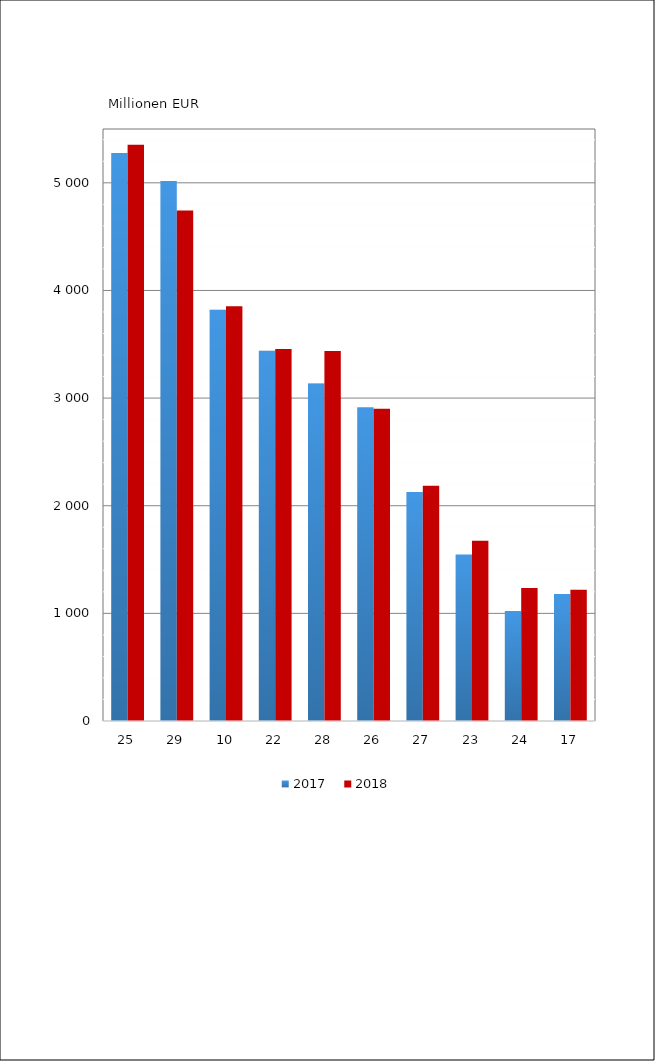
| Category | 2017 | 2018 |
|---|---|---|
| 0 | 5277.548 | 5353.251 |
| 1 | 5017.037 | 4742.836 |
| 2 | 3821.658 | 3854.408 |
| 3 | 3439.346 | 3457.095 |
| 4 | 3134.534 | 3436.434 |
| 5 | 2913.868 | 2900.765 |
| 6 | 2127.809 | 2186.707 |
| 7 | 1547.556 | 1674.65 |
| 8 | 1022.088 | 1235.241 |
| 9 | 1179.839 | 1220.144 |